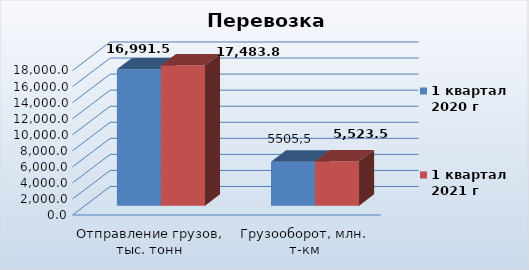
| Category | 1 квартал
2020 г | 1 квартал
2021 г |
|---|---|---|
| Отправление грузов, тыс. тонн | 16991.5 | 17483.8 |
| Грузооборот, млн. т-км | 5479.2 | 5523.5 |